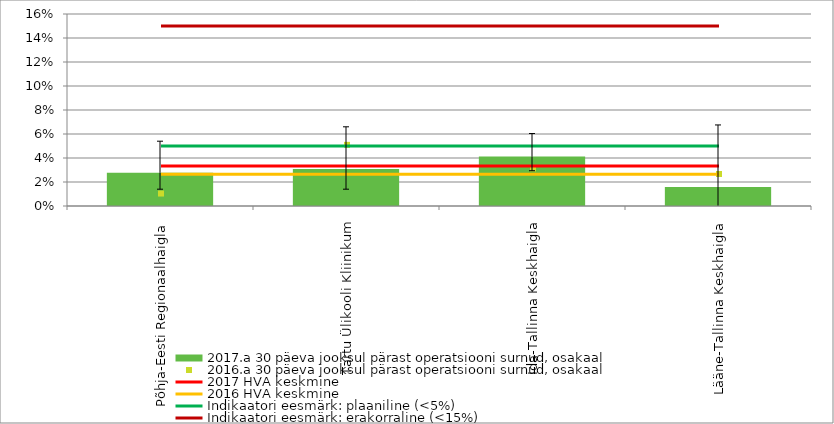
| Category | 2017.a 30 päeva jooksul pärast operatsiooni surnud, osakaal |
|---|---|
| Põhja-Eesti Regionaalhaigla | 0.028 |
| Tartu Ülikooli Kliinikum | 0.031 |
| Ida-Tallinna Keskhaigla | 0.041 |
| Lääne-Tallinna Keskhaigla | 0.016 |